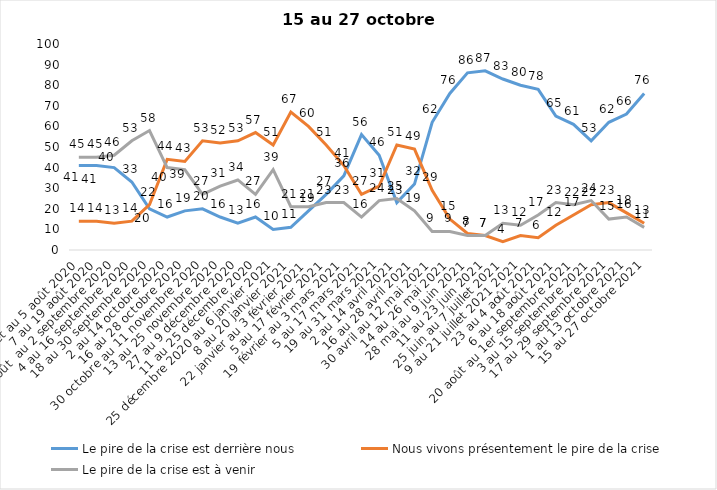
| Category | Le pire de la crise est derrière nous | Nous vivons présentement le pire de la crise | Le pire de la crise est à venir |
|---|---|---|---|
| 24 juillet au 5 août 2020 | 41 | 14 | 45 |
| 7 au 19 août 2020 | 41 | 14 | 45 |
| 21 août  au 2 septembre 2020 | 40 | 13 | 46 |
| 4 au 16 septembre 2020 | 33 | 14 | 53 |
| 18 au 30 septembre 2020 | 20 | 22 | 58 |
| 2 au 14 octobre 2020 | 16 | 44 | 40 |
| 16 au 28 octobre 2020 | 19 | 43 | 39 |
| 30 octobre au 11 novembre 2020 | 20 | 53 | 27 |
| 13 au 25 novembre 2020 | 16 | 52 | 31 |
| 27 au 9 décembre 2020 | 13 | 53 | 34 |
| 11 au 25 décembre 2020 | 16 | 57 | 27 |
| 25 décembre 2020 au 6 janvier 2021 | 10 | 51 | 39 |
| 8 au 20 janvier 2021 | 11 | 67 | 21 |
| 22 janvier au 3 février 2021 | 19 | 60 | 21 |
| 5 au 17 février 2021 | 27 | 51 | 23 |
| 19 février au 3 mars 2021 | 36 | 41 | 23 |
| 5 au 17 mars 2021 | 56 | 27 | 16 |
| 19 au 31 mars 2021 | 46 | 31 | 24 |
| 2 au 14 avril 2021 | 23 | 51 | 25 |
| 16 au 28 avril 2021 | 32 | 49 | 19 |
| 30 avril au 12 mai 2021 | 62 | 29 | 9 |
| 14 au 26 mai 2021 | 76 | 15 | 9 |
| 28 mai au 9 juin 2021 | 86 | 8 | 7 |
| 11 au 23 juin 2021 | 87 | 7 | 7 |
| 25 juin au 7 juillet 2021 | 83 | 4 | 13 |
| 9 au 21 juillet 2021 2021 | 80 | 7 | 12 |
| 23 au 4 août 2021 | 78 | 6 | 17 |
| 6 au 18 août 2021 | 65 | 12 | 23 |
| 20 août au 1er septembre 2021 | 61 | 17 | 22 |
| 3 au 15 septembre 2021 | 53 | 22 | 24 |
| 17 au 29 septembre 2021 | 62 | 23 | 15 |
| 1 au 13 octobre 2021 | 66 | 18 | 16 |
| 15 au 27 octobre 2021 | 76 | 13 | 11 |